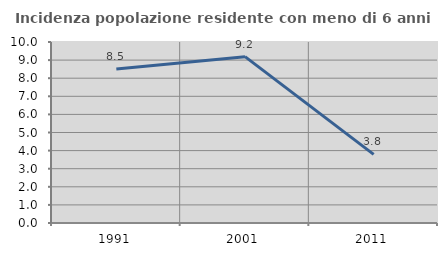
| Category | Incidenza popolazione residente con meno di 6 anni |
|---|---|
| 1991.0 | 8.511 |
| 2001.0 | 9.191 |
| 2011.0 | 3.793 |